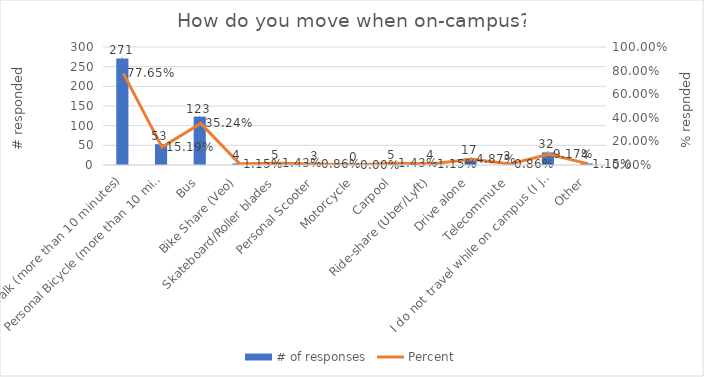
| Category | # of responses |
|---|---|
| Walk (more than 10 minutes) | 271 |
| Personal Bicycle (more than 10 minutes) | 53 |
| Bus | 123 |
| Bike Share (Veo) | 4 |
| Skateboard/Roller blades | 5 |
| Personal Scooter | 3 |
| Motorcycle | 0 |
| Carpool | 5 |
| Ride-share (Uber/Lyft) | 4 |
| Drive alone | 17 |
| Telecommute | 3 |
| I do not travel while on campus (I just go back to my place of residence after work/class/lab) | 32 |
| Other | 4 |